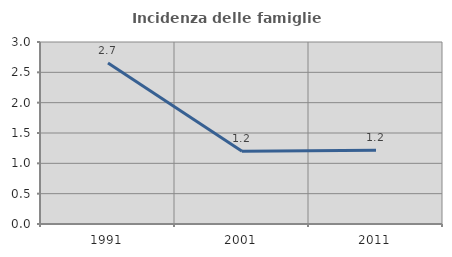
| Category | Incidenza delle famiglie numerose |
|---|---|
| 1991.0 | 2.653 |
| 2001.0 | 1.199 |
| 2011.0 | 1.214 |